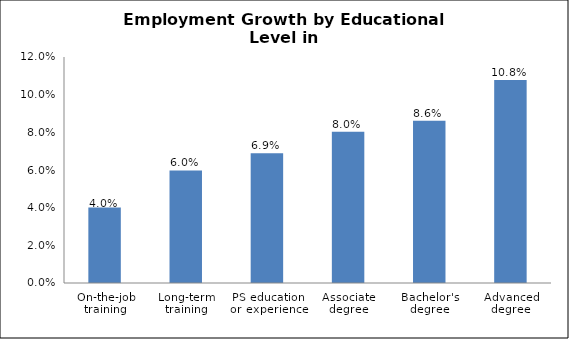
| Category | Series 0 |
|---|---|
| On-the-job training | 0.04 |
| Long-term training | 0.06 |
| PS education or experience | 0.069 |
| Associate degree | 0.08 |
| Bachelor's degree | 0.086 |
| Advanced degree | 0.108 |